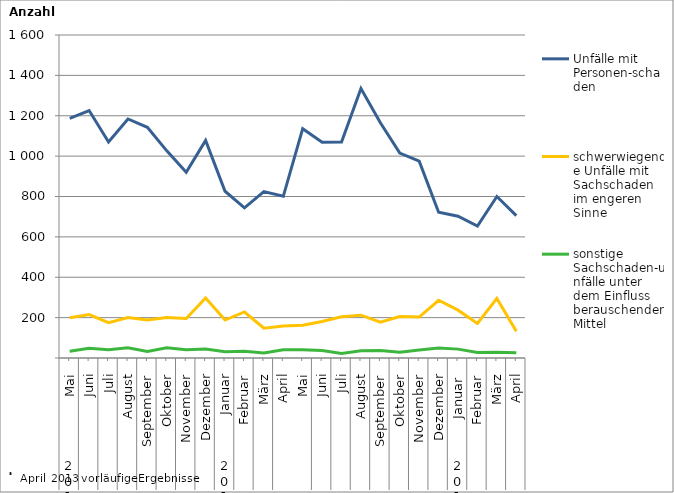
| Category | Unfälle mit Personen-schaden | schwerwiegende Unfälle mit Sachschaden   im engeren Sinne | sonstige Sachschaden-unfälle unter dem Einfluss berauschender Mittel |
|---|---|---|---|
| 0 | 1187 | 199 | 33 |
| 1 | 1226 | 215 | 48 |
| 2 | 1070 | 175 | 41 |
| 3 | 1184 | 200 | 51 |
| 4 | 1143 | 188 | 32 |
| 5 | 1026 | 200 | 51 |
| 6 | 920 | 196 | 41 |
| 7 | 1078 | 297 | 45 |
| 8 | 826 | 188 | 31 |
| 9 | 744 | 228 | 34 |
| 10 | 824 | 148 | 25 |
| 11 | 801 | 159 | 41 |
| 12 | 1136 | 162 | 41 |
| 13 | 1069 | 181 | 37 |
| 14 | 1070 | 204 | 22 |
| 15 | 1335 | 212 | 36 |
| 16 | 1165 | 177 | 37 |
| 17 | 1015 | 205 | 28 |
| 18 | 975 | 203 | 40 |
| 19 | 722 | 286 | 50 |
| 20 | 702 | 237 | 44 |
| 21 | 653 | 171 | 27 |
| 22 | 800 | 295 | 28 |
| 23 | 705 | 133 | 26 |